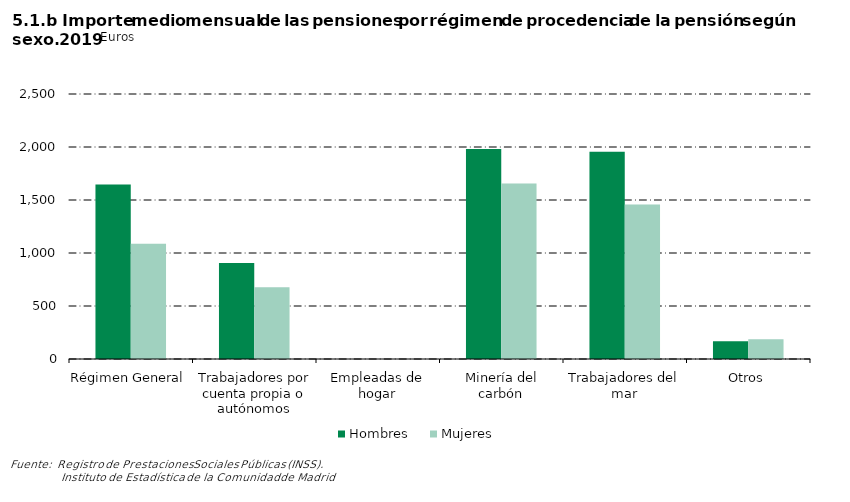
| Category | Hombres | Mujeres |
|---|---|---|
| Régimen General | 1646.678 | 1087.075 |
| Trabajadores por cuenta propia o autónomos | 906.503 | 675.927 |
| Empleadas de hogar | 0 | 0 |
| Minería del carbón | 1981.172 | 1655.611 |
| Trabajadores del mar | 1954.35 | 1458.004 |
| Otros | 166.592 | 186.81 |